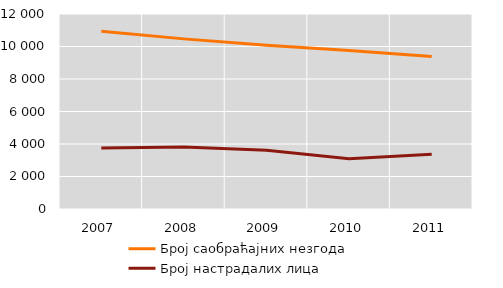
| Category | Број саобраћајних незгода | Број настрадалих лица |
|---|---|---|
| 2007.0 | 10933 | 3749 |
| 2008.0 | 10469 | 3819 |
| 2009.0 | 10076 | 3618 |
| 2010.0 | 9752 | 3096 |
| 2011.0 | 9379 | 3365 |